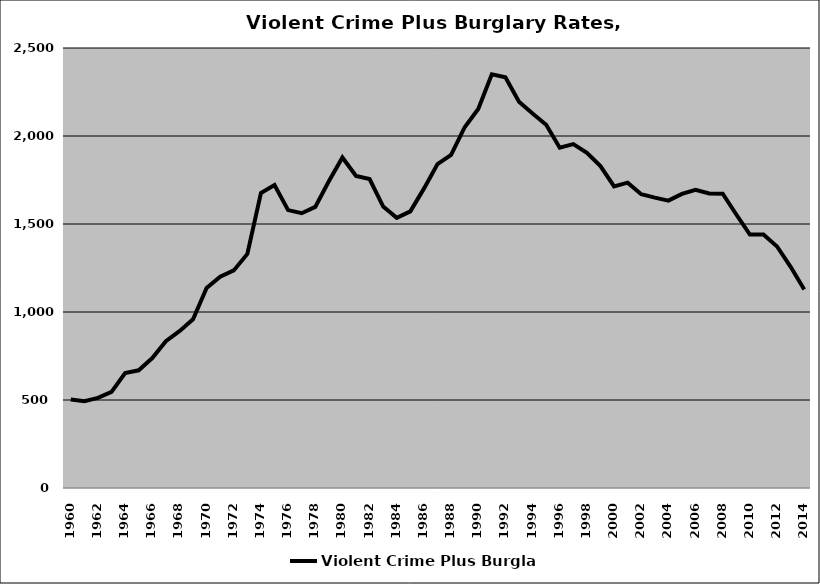
| Category | Violent Crime Plus Burglary |
|---|---|
| 1960.0 | 502.88 |
| 1961.0 | 493.281 |
| 1962.0 | 512.302 |
| 1963.0 | 545.924 |
| 1964.0 | 653.627 |
| 1965.0 | 668.844 |
| 1966.0 | 738.18 |
| 1967.0 | 834.381 |
| 1968.0 | 890.769 |
| 1969.0 | 959.097 |
| 1970.0 | 1135.996 |
| 1971.0 | 1200.777 |
| 1972.0 | 1236.325 |
| 1973.0 | 1329.831 |
| 1974.0 | 1675.816 |
| 1975.0 | 1721.556 |
| 1976.0 | 1578.899 |
| 1977.0 | 1561.213 |
| 1978.0 | 1597.364 |
| 1979.0 | 1742.704 |
| 1980.0 | 1877.914 |
| 1981.0 | 1773.332 |
| 1982.0 | 1755.308 |
| 1983.0 | 1599.129 |
| 1984.0 | 1534.988 |
| 1985.0 | 1571.735 |
| 1986.0 | 1700.916 |
| 1987.0 | 1840.059 |
| 1988.0 | 1893.105 |
| 1989.0 | 2049.825 |
| 1990.0 | 2153.927 |
| 1991.0 | 2350.661 |
| 1992.0 | 2334.02 |
| 1993.0 | 2195.076 |
| 1994.0 | 2127.666 |
| 1995.0 | 2063.975 |
| 1996.0 | 1933.729 |
| 1997.0 | 1953.845 |
| 1998.0 | 1903.976 |
| 1999.0 | 1828.975 |
| 2000.0 | 1713.674 |
| 2001.0 | 1734.733 |
| 2002.0 | 1669.348 |
| 2003.0 | 1649.767 |
| 2004.0 | 1632.662 |
| 2005.0 | 1671.36 |
| 2006.0 | 1694.754 |
| 2007.0 | 1673.827 |
| 2008.0 | 1672.529 |
| 2009.0 | 1553.969 |
| 2010.0 | 1440.336 |
| 2011.0 | 1439.784 |
| 2012.0 | 1372.405 |
| 2013.0 | 1256.676 |
| 2014.0 | 1127.719 |